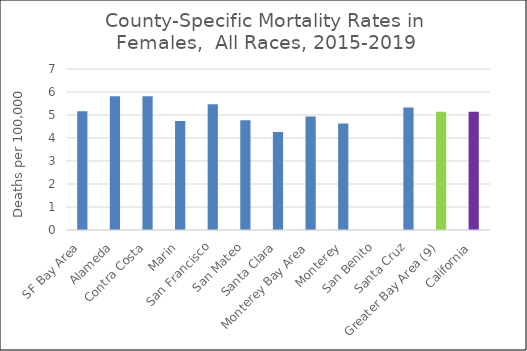
| Category | Female |
|---|---|
| SF Bay Area | 5.16 |
|   Alameda | 5.81 |
|   Contra Costa | 5.82 |
|   Marin | 4.74 |
|   San Francisco | 5.47 |
|   San Mateo | 4.77 |
|   Santa Clara | 4.26 |
| Monterey Bay Area | 4.94 |
|   Monterey | 4.63 |
|   San Benito | 0 |
|   Santa Cruz | 5.33 |
| Greater Bay Area (9) | 5.14 |
| California | 5.14 |